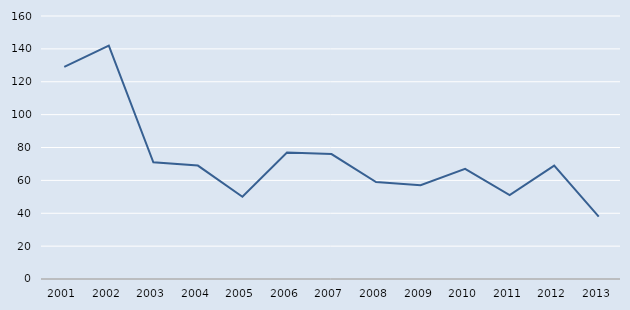
| Category | Series 0 |
|---|---|
| 2001.0 | 129 |
| 2002.0 | 142 |
| 2003.0 | 71 |
| 2004.0 | 69 |
| 2005.0 | 50 |
| 2006.0 | 77 |
| 2007.0 | 76 |
| 2008.0 | 59 |
| 2009.0 | 57 |
| 2010.0 | 67 |
| 2011.0 | 51 |
| 2012.0 | 69 |
| 2013.0 | 38 |